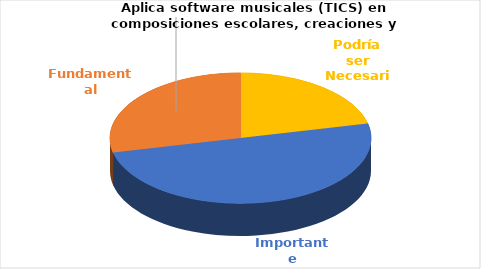
| Category | Series 0 |
|---|---|
| Podría ser Necesaria | 3 |
| Importante | 7 |
| Fundamental | 4 |